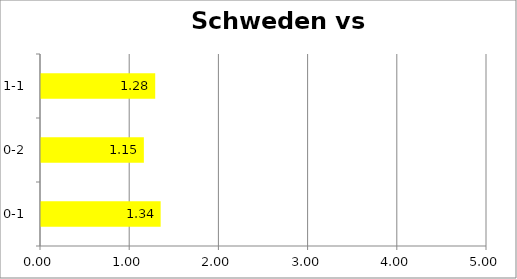
| Category | Series 0 |
|---|---|
| 0-1 | 1.341 |
| 0-2 | 1.153 |
| 1-1 | 1.28 |